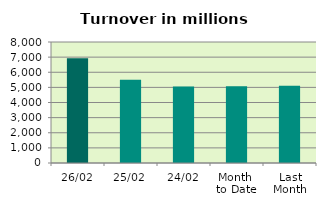
| Category | Series 0 |
|---|---|
| 26/02 | 6930.104 |
| 25/02 | 5502.352 |
| 24/02 | 5058.778 |
| Month 
to Date | 5069.383 |
| Last
Month | 5105.691 |